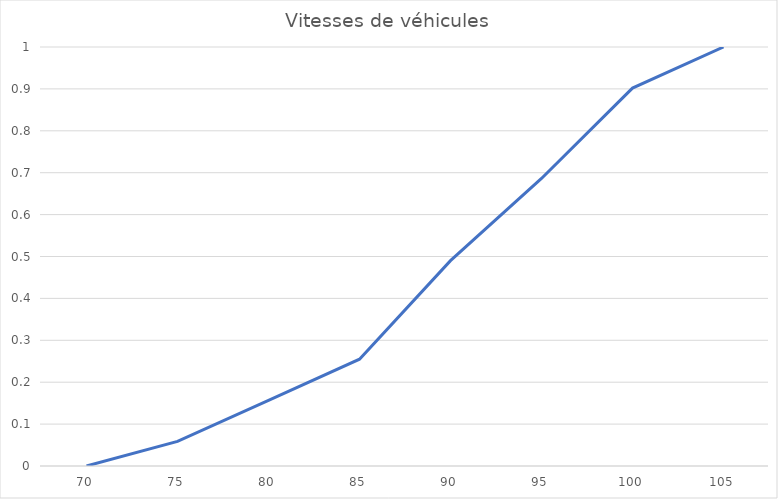
| Category | Series 0 |
|---|---|
| 70.0 | 0 |
| 75.0 | 0.059 |
| 80.0 | 0.157 |
| 85.0 | 0.255 |
| 90.0 | 0.49 |
| 95.0 | 0.686 |
| 100.0 | 0.902 |
| 105.0 | 1 |